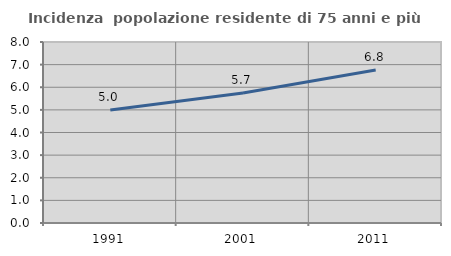
| Category | Incidenza  popolazione residente di 75 anni e più |
|---|---|
| 1991.0 | 4.993 |
| 2001.0 | 5.747 |
| 2011.0 | 6.763 |